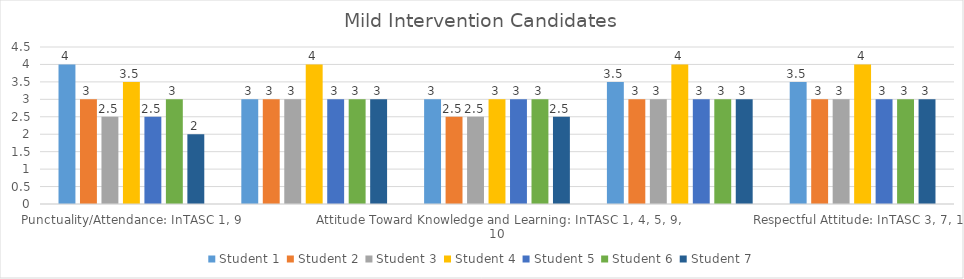
| Category | Student 1 | Student 2 | Student 3 | Student 4 | Student 5 | Student 6 | Student 7 |
|---|---|---|---|---|---|---|---|
| Punctuality/Attendance: InTASC 1, 9 | 4 | 3 | 2.5 | 3.5 | 2.5 | 3 | 2 |
| Interactions with Others: InTASC 3, 7, 10 | 3 | 3 | 3 | 4 | 3 | 3 | 3 |
| Attitude Toward Knowledge and Learning: InTASC 1, 4, 5, 9, 10 | 3 | 2.5 | 2.5 | 3 | 3 | 3 | 2.5 |
| Patience: InTASC 3, 10 | 3.5 | 3 | 3 | 4 | 3 | 3 | 3 |
| Respectful Attitude: InTASC 3, 7, 10 | 3.5 | 3 | 3 | 4 | 3 | 3 | 3 |